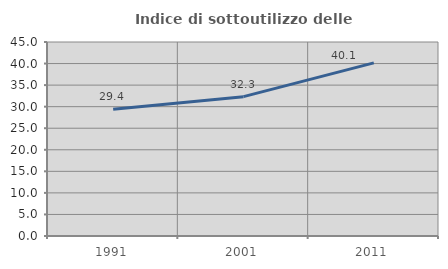
| Category | Indice di sottoutilizzo delle abitazioni  |
|---|---|
| 1991.0 | 29.397 |
| 2001.0 | 32.326 |
| 2011.0 | 40.15 |